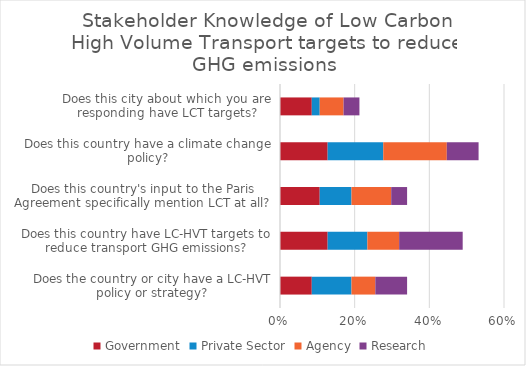
| Category | Government | Private Sector | Agency | Research |
|---|---|---|---|---|
| Does the country or city have a LC-HVT policy or strategy? | 0.085 | 0.106 | 0.064 | 0.085 |
| Does this country have LC-HVT targets to reduce transport GHG emissions? | 0.128 | 0.106 | 0.085 | 0.17 |
| Does this country's input to the Paris Agreement specifically mention LCT at all? | 0.106 | 0.085 | 0.106 | 0.043 |
| Does this country have a climate change policy? | 0.128 | 0.149 | 0.17 | 0.085 |
| Does this city about which you are responding have LCT targets? | 0.085 | 0.021 | 0.064 | 0.043 |